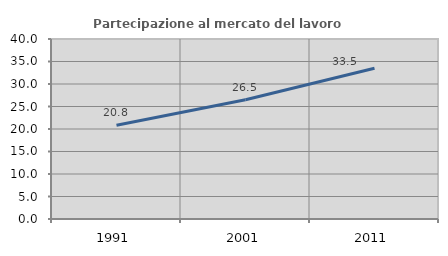
| Category | Partecipazione al mercato del lavoro  femminile |
|---|---|
| 1991.0 | 20.817 |
| 2001.0 | 26.496 |
| 2011.0 | 33.483 |